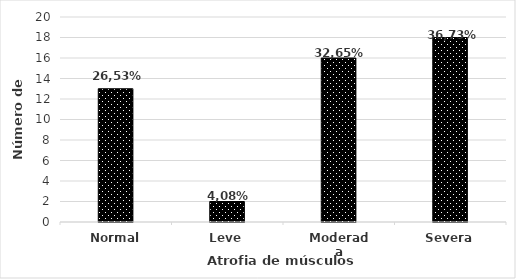
| Category | N° de indíviduos |
|---|---|
| Normal | 13 |
| Leve | 2 |
| Moderada | 16 |
| Severa | 18 |